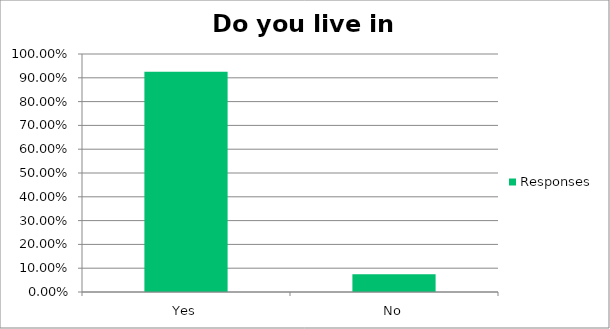
| Category | Responses |
|---|---|
| Yes | 0.926 |
| No | 0.074 |